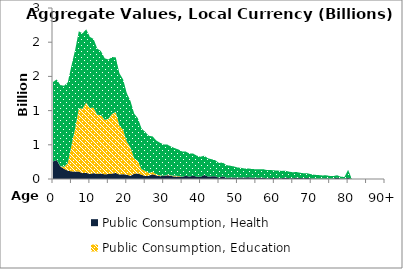
| Category | Public Consumption, Health | Public Consumption, Education | Public Consumption, Other than health and education |
|---|---|---|---|
| 0 | 257.797 | 0 | 1160.526 |
|  | 277.176 | 1.589 | 1176.845 |
| 2 | 183.717 | 4.289 | 1185.011 |
| 3 | 149.413 | 28.593 | 1185.708 |
| 4 | 122.767 | 109.04 | 1179.631 |
| 5 | 111.79 | 377.691 | 1167.466 |
| 6 | 108.866 | 628.956 | 1149.904 |
| 7 | 109.297 | 922.187 | 1127.63 |
| 8 | 85.341 | 942.57 | 1101.338 |
| 9 | 90.759 | 1026.275 | 1071.716 |
| 10 | 74.694 | 963.347 | 1039.054 |
| 11 | 86.041 | 958.017 | 1003.638 |
| 12 | 76.265 | 862.254 | 968.158 |
| 13 | 80.124 | 855.822 | 934.092 |
| 14 | 68.524 | 796.123 | 900.94 |
| 15 | 72.384 | 807.479 | 866.643 |
| 16 | 79.506 | 871.445 | 831.541 |
| 17 | 88.488 | 893.773 | 798.084 |
| 18 | 66.521 | 713.516 | 767.272 |
| 19 | 71.442 | 647.293 | 738.337 |
| 20 | 63.494 | 482.236 | 709.67 |
| 21 | 46.711 | 413.334 | 681.791 |
| 22 | 77.595 | 225.062 | 653.87 |
| 23 | 80.436 | 183.612 | 625.407 |
| 24 | 63.064 | 79.865 | 596.999 |
| 25 | 41.75 | 76.624 | 569.604 |
| 26 | 49.223 | 39.012 | 542.837 |
| 27 | 69.846 | 34.806 | 518.244 |
| 28 | 53.208 | 12.385 | 496.637 |
| 29 | 40.858 | 12.758 | 477.203 |
| 30 | 44.589 | 2.315 | 458.316 |
| 31 | 56.415 | 6.228 | 440.277 |
| 32 | 45.103 | 7.414 | 422.524 |
| 33 | 34.838 | 11.617 | 404.595 |
| 34 | 36.884 | 8.455 | 386.774 |
| 35 | 30.562 | 2.24 | 369.649 |
| 36 | 48.156 | 0 | 352.946 |
| 37 | 34.914 | 0 | 337.084 |
| 38 | 48.972 | 0 | 322.279 |
| 39 | 33.195 | 0 | 308.167 |
| 40 | 31.052 | 0 | 294.392 |
| 41 | 59.302 | 0 | 281.302 |
| 42 | 35.699 | 0 | 267.061 |
| 43 | 38.76 | 0 | 250.805 |
| 44 | 40.86 | 0 | 233.496 |
| 45 | 17.193 | 0 | 217.089 |
| 46 | 40.607 | 0 | 201.358 |
| 47 | 16.238 | 0 | 186.636 |
| 48 | 21.247 | 0 | 173.336 |
| 49 | 22.776 | 0 | 161.412 |
| 50 | 18.531 | 0 | 150.033 |
| 51 | 23.786 | 0 | 138.924 |
| 52 | 21.592 | 0 | 130.836 |
| 53 | 26.875 | 0 | 126.904 |
| 54 | 19.646 | 0 | 125.763 |
| 55 | 18.244 | 0 | 124.845 |
| 56 | 16.233 | 0 | 124.6 |
| 57 | 19.535 | 0 | 123.597 |
| 58 | 9.767 | 0 | 120.846 |
| 59 | 14.044 | 0 | 116.919 |
| 60 | 13.104 | 0 | 113.502 |
| 61 | 12.529 | 0 | 110.398 |
| 62 | 11.977 | 0 | 106.401 |
| 63 | 19.524 | 0 | 101.12 |
| 64 | 12.74 | 0 | 95.014 |
| 65 | 9.9 | 0 | 88.926 |
| 66 | 19.765 | 0 | 82.702 |
| 67 | 14.166 | 0 | 76.824 |
| 68 | 12.146 | 0 | 71.622 |
| 69 | 16.495 | 0 | 66.893 |
| 70 | 7.155 | 0 | 62.08 |
| 71 | 3.808 | 0 | 57.272 |
| 72 | 5.058 | 0 | 52.73 |
| 73 | 3.634 | 0 | 48.525 |
| 74 | 9.776 | 0 | 44.574 |
| 75 | 4.394 | 0 | 40.771 |
| 76 | 5.759 | 0 | 37.191 |
| 77 | 21.337 | 0 | 33.538 |
| 78 | 4.447 | 0 | 29.685 |
| 79 | 3.343 | 0 | 25.782 |
| 80 | 17.757 | 0 | 115.89 |
| 81 | 0 | 0 | 0 |
| 82 | 0 | 0 | 0 |
| 83 | 0 | 0 | 0 |
| 84 | 0 | 0 | 0 |
| 85 | 0 | 0 | 0 |
| 86 | 0 | 0 | 0 |
| 87 | 0 | 0 | 0 |
| 88 | 0 | 0 | 0 |
| 89 | 0 | 0 | 0 |
| 90+ | 0 | 0 | 0 |